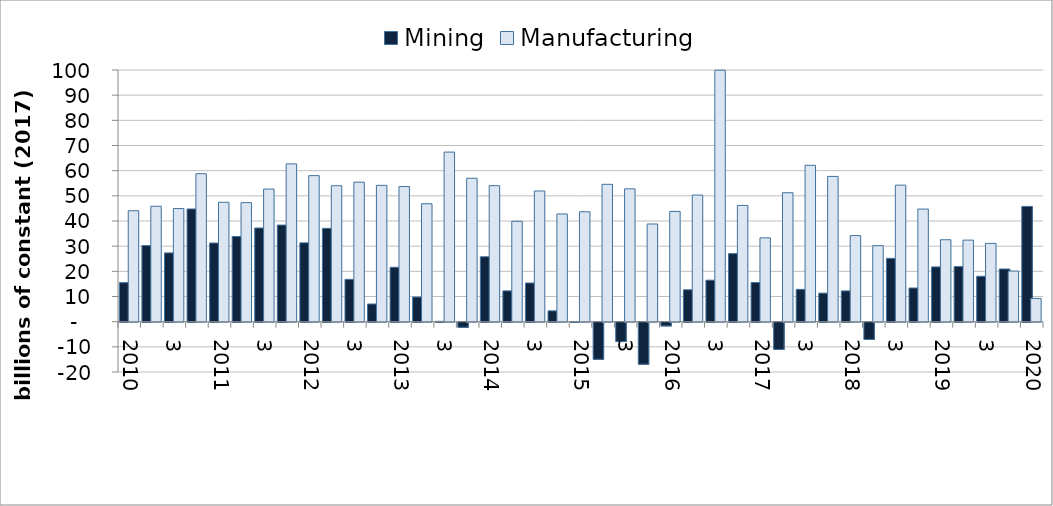
| Category | Mining | Manufacturing |
|---|---|---|
| 2010.0 | 15.502 | 44.084 |
| 2.0 | 30.223 | 45.856 |
| 3.0 | 27.317 | 44.947 |
| 4.0 | 44.778 | 58.803 |
| 2011.0 | 31.246 | 47.444 |
| 2.0 | 33.838 | 47.298 |
| 3.0 | 37.21 | 52.696 |
| 4.0 | 38.374 | 62.688 |
| 2012.0 | 31.31 | 58.024 |
| 2.0 | 37.078 | 54.011 |
| 3.0 | 16.813 | 55.428 |
| 4.0 | 7.017 | 54.159 |
| 2013.0 | 21.612 | 53.696 |
| 2.0 | 9.777 | 46.844 |
| 3.0 | 0.133 | 67.381 |
| 4.0 | -2.015 | 56.991 |
| 2014.0 | 25.788 | 54.054 |
| 2.0 | 12.237 | 39.888 |
| 3.0 | 15.364 | 51.917 |
| 4.0 | 4.289 | 42.795 |
| 2015.0 | -0.129 | 43.677 |
| 2.0 | -14.738 | 54.578 |
| 3.0 | -7.698 | 52.775 |
| 4.0 | -16.692 | 38.811 |
| 2016.0 | -1.467 | 43.807 |
| 2.0 | 12.674 | 50.312 |
| 3.0 | 16.493 | 99.909 |
| 4.0 | 27.033 | 46.197 |
| 2017.0 | 15.557 | 33.303 |
| 2.0 | -10.829 | 51.229 |
| 3.0 | 12.828 | 62.14 |
| 4.0 | 11.335 | 57.719 |
| 2018.0 | 12.217 | 34.189 |
| 2.0 | -6.861 | 30.195 |
| 3.0 | 25.16 | 54.24 |
| 4.0 | 13.374 | 44.742 |
| 2019.0 | 21.752 | 32.552 |
| 2.0 | 21.88 | 32.406 |
| 3.0 | 18.026 | 31.112 |
| 4.0 | 20.929 | 20.11 |
| 2020.0 | 45.805 | 9.241 |